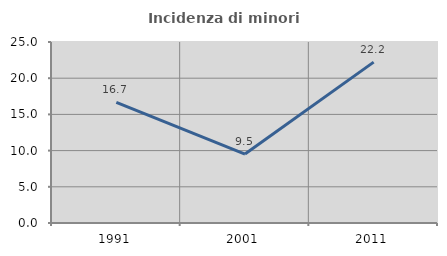
| Category | Incidenza di minori stranieri |
|---|---|
| 1991.0 | 16.667 |
| 2001.0 | 9.524 |
| 2011.0 | 22.222 |